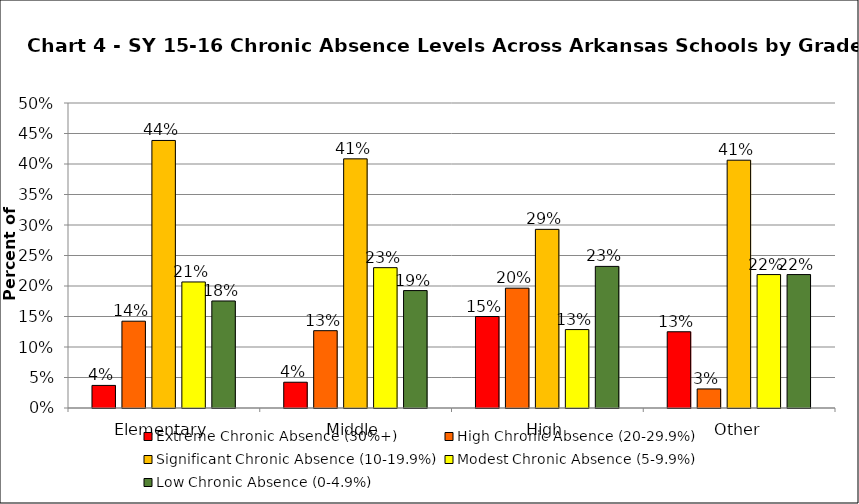
| Category | Extreme Chronic Absence (30%+) | High Chronic Absence (20-29.9%) | Significant Chronic Absence (10-19.9%) | Modest Chronic Absence (5-9.9%) | Low Chronic Absence (0-4.9%) |
|---|---|---|---|---|---|
| 0 | 0.037 | 0.142 | 0.439 | 0.207 | 0.175 |
| 1 | 0.042 | 0.127 | 0.408 | 0.23 | 0.192 |
| 2 | 0.15 | 0.196 | 0.293 | 0.129 | 0.232 |
| 3 | 0.125 | 0.031 | 0.406 | 0.219 | 0.219 |